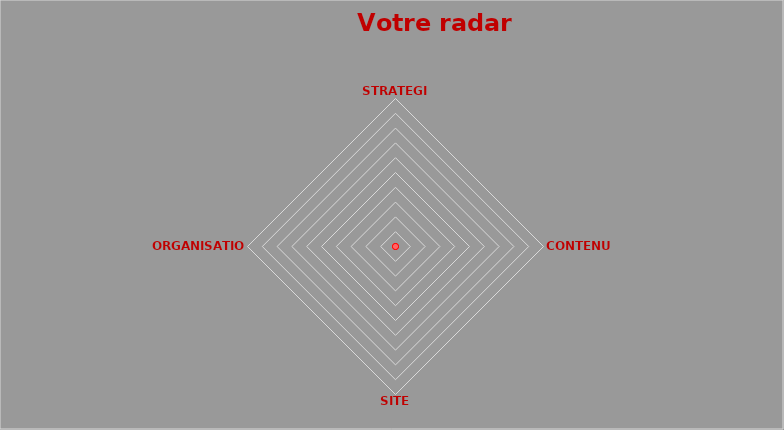
| Category | Series 0 |
|---|---|
| STRATEGIE | 0 |
| CONTENUS | 0 |
| SITE WEB | 0 |
| ORGANISATION | 0 |